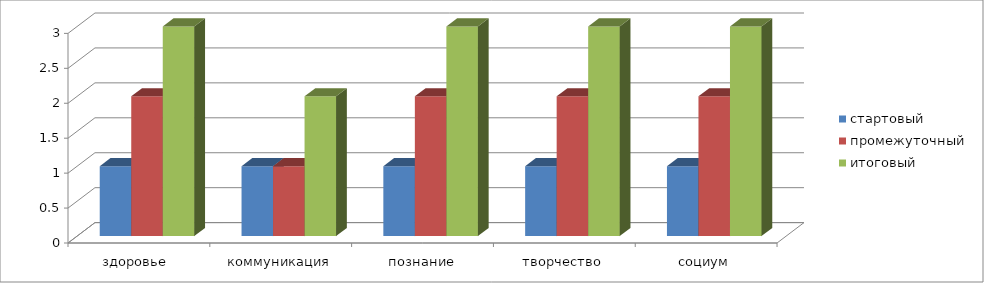
| Category | стартовый | промежуточный | итоговый |
|---|---|---|---|
| здоровье  | 1 | 2 | 3 |
| коммуникация | 1 | 1 | 2 |
| познание | 1 | 2 | 3 |
| творчество | 1 | 2 | 3 |
| социум | 1 | 2 | 3 |